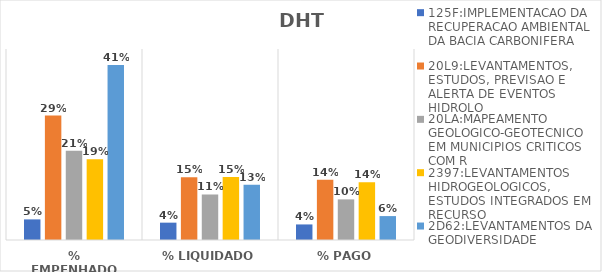
| Category | 125F:IMPLEMENTACAO DA RECUPERACAO AMBIENTAL DA BACIA CARBONIFERA | 20L9:LEVANTAMENTOS, ESTUDOS, PREVISAO E ALERTA DE EVENTOS HIDROLO | 20LA:MAPEAMENTO GEOLOGICO-GEOTECNICO EM MUNICIPIOS CRITICOS COM R | 2397:LEVANTAMENTOS HIDROGEOLOGICOS, ESTUDOS INTEGRADOS EM RECURSO | 2D62:LEVANTAMENTOS DA GEODIVERSIDADE |
|---|---|---|---|---|---|
| % EMPENHADO | 0.049 | 0.293 | 0.21 | 0.19 | 0.412 |
| % LIQUIDADO | 0.041 | 0.148 | 0.107 | 0.148 | 0.13 |
| % PAGO | 0.037 | 0.142 | 0.096 | 0.136 | 0.056 |